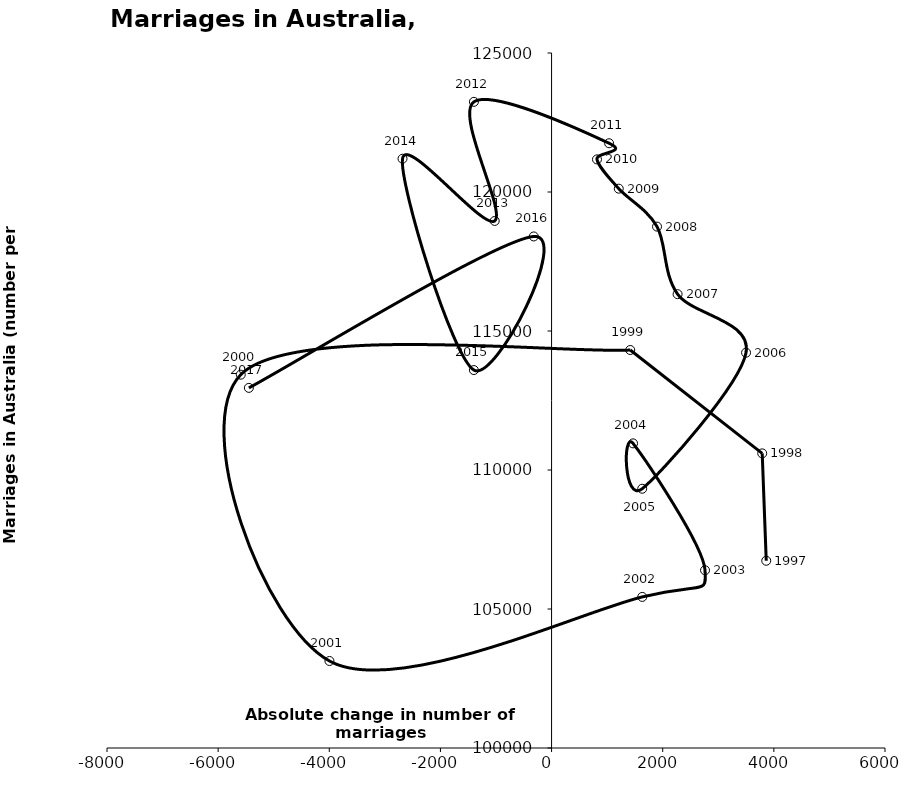
| Category | Series 0 |
|---|---|
| 3863.0 | 106735 |
| 3790.5 | 110598 |
| 1415.5 | 114316 |
| -5593.0 | 113429 |
| -3997.0 | 103130 |
| 1632.0 | 105435 |
| 2761.5 | 106394 |
| 1466.0 | 110958 |
| 1631.0 | 109326 |
| 3499.5 | 114220 |
| 2267.5 | 116325 |
| 1897.5 | 118755 |
| 1209.0 | 120120 |
| 817.0 | 121173 |
| 1035.0 | 121754 |
| -1397.5 | 123243 |
| -1023.0 | 118959 |
| -2682.0 | 121197 |
| -1398.0 | 113595 |
| -320.5 | 118401 |
| -5447.0 | 112954 |